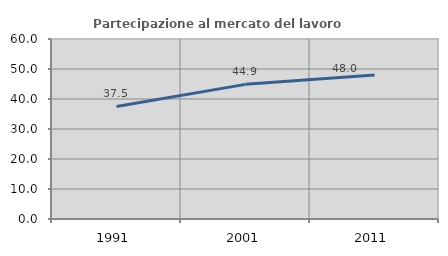
| Category | Partecipazione al mercato del lavoro  femminile |
|---|---|
| 1991.0 | 37.531 |
| 2001.0 | 44.879 |
| 2011.0 | 47.979 |